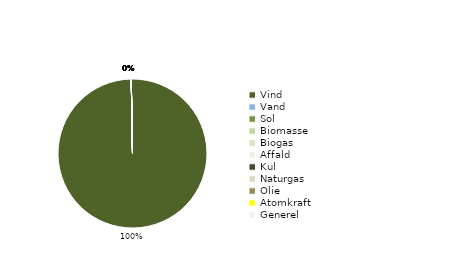
| Category | Series 0 | Series 1 |
|---|---|---|
| Vind | 1 |  |
| Vand | 0 |  |
| Sol | 0 |  |
| Biomasse | 0 |  |
| Biogas | 0 |  |
| Affald | 0 |  |
| Kul | 0 |  |
| Naturgas | 0 |  |
| Olie | 0 |  |
| Atomkraft | 0 |  |
| Generel | 0 |  |